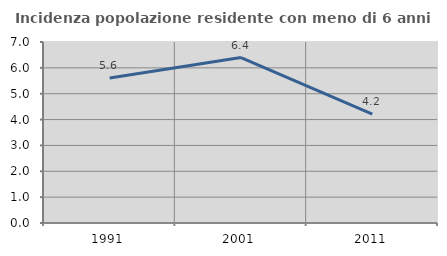
| Category | Incidenza popolazione residente con meno di 6 anni |
|---|---|
| 1991.0 | 5.607 |
| 2001.0 | 6.397 |
| 2011.0 | 4.211 |